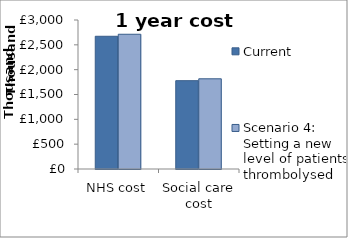
| Category | Current  | Scenario 4: Setting a new level of patients thrombolysed |
|---|---|---|
| NHS cost | 2672500 | 2713000 |
| Social care cost | 1778600 | 1816300 |